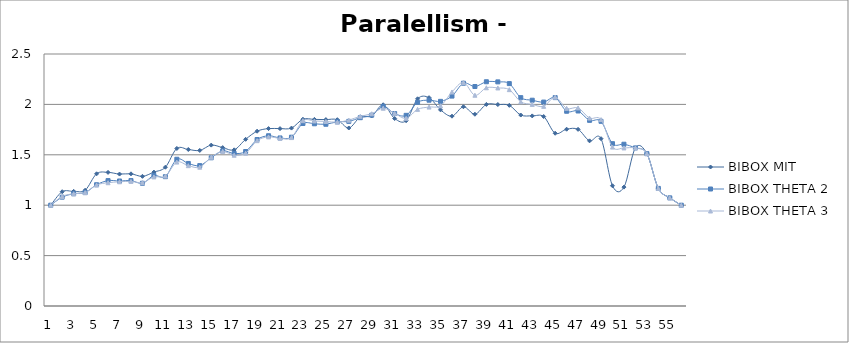
| Category | BIBOX MIT | BIBOX THETA 2 | BIBOX THETA 3 |
|---|---|---|---|
| 1.0 | 1 | 1 | 1 |
| 2.0 | 1.134 | 1.08 | 1.087 |
| 3.0 | 1.137 | 1.114 | 1.113 |
| 4.0 | 1.149 | 1.125 | 1.125 |
| 5.0 | 1.311 | 1.203 | 1.201 |
| 6.0 | 1.326 | 1.244 | 1.223 |
| 7.0 | 1.309 | 1.24 | 1.232 |
| 8.0 | 1.311 | 1.244 | 1.236 |
| 9.0 | 1.286 | 1.218 | 1.224 |
| 10.0 | 1.328 | 1.294 | 1.281 |
| 11.0 | 1.377 | 1.283 | 1.289 |
| 12.0 | 1.563 | 1.456 | 1.428 |
| 13.0 | 1.552 | 1.414 | 1.392 |
| 14.0 | 1.543 | 1.393 | 1.377 |
| 15.0 | 1.596 | 1.47 | 1.476 |
| 16.0 | 1.571 | 1.539 | 1.534 |
| 17.0 | 1.549 | 1.513 | 1.496 |
| 18.0 | 1.654 | 1.532 | 1.516 |
| 19.0 | 1.734 | 1.651 | 1.64 |
| 20.0 | 1.76 | 1.689 | 1.678 |
| 21.0 | 1.76 | 1.667 | 1.663 |
| 22.0 | 1.765 | 1.675 | 1.671 |
| 23.0 | 1.853 | 1.811 | 1.838 |
| 24.0 | 1.851 | 1.808 | 1.836 |
| 25.0 | 1.849 | 1.803 | 1.831 |
| 26.0 | 1.848 | 1.828 | 1.823 |
| 27.0 | 1.766 | 1.832 | 1.844 |
| 28.0 | 1.875 | 1.868 | 1.882 |
| 29.0 | 1.886 | 1.893 | 1.907 |
| 30.0 | 1.996 | 1.979 | 1.962 |
| 31.0 | 1.86 | 1.909 | 1.911 |
| 32.0 | 1.838 | 1.892 | 1.862 |
| 33.0 | 2.055 | 2.021 | 1.951 |
| 34.0 | 2.067 | 2.042 | 1.973 |
| 35.0 | 1.946 | 2.03 | 1.986 |
| 36.0 | 1.883 | 2.082 | 2.123 |
| 37.0 | 1.977 | 2.21 | 2.217 |
| 38.0 | 1.902 | 2.177 | 2.091 |
| 39.0 | 2 | 2.225 | 2.165 |
| 40.0 | 1.998 | 2.223 | 2.163 |
| 41.0 | 1.991 | 2.206 | 2.146 |
| 42.0 | 1.894 | 2.067 | 2.026 |
| 43.0 | 1.886 | 2.042 | 2 |
| 44.0 | 1.879 | 2.023 | 1.981 |
| 45.0 | 1.714 | 2.067 | 2.072 |
| 46.0 | 1.754 | 1.932 | 1.961 |
| 47.0 | 1.752 | 1.935 | 1.965 |
| 48.0 | 1.639 | 1.842 | 1.864 |
| 49.0 | 1.66 | 1.832 | 1.849 |
| 50.0 | 1.193 | 1.61 | 1.576 |
| 51.0 | 1.179 | 1.605 | 1.568 |
| 52.0 | 1.568 | 1.568 | 1.568 |
| 53.0 | 1.512 | 1.512 | 1.512 |
| 54.0 | 1.167 | 1.167 | 1.167 |
| 55.0 | 1.073 | 1.073 | 1.073 |
| 56.0 | 1 | 1 | 1 |